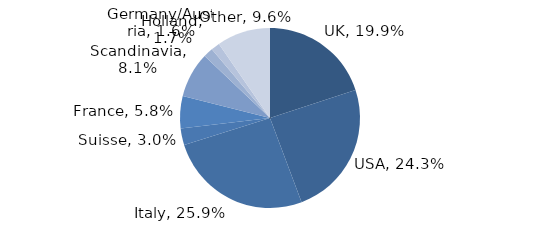
| Category | Investment Style |
|---|---|
| UK | 0.199 |
| USA | 0.243 |
| Italy | 0.259 |
| Suisse | 0.03 |
| France | 0.058 |
| Scandinavia | 0.081 |
| Holland | 0.017 |
| Germany/Austria | 0.016 |
| Other | 0.096 |